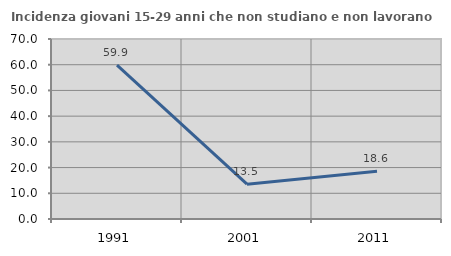
| Category | Incidenza giovani 15-29 anni che non studiano e non lavorano  |
|---|---|
| 1991.0 | 59.871 |
| 2001.0 | 13.538 |
| 2011.0 | 18.577 |